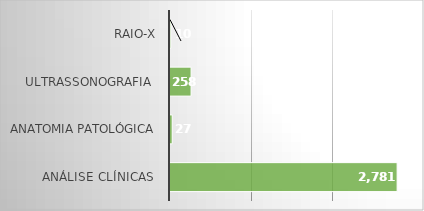
| Category | Series 0 |
|---|---|
| Análise Clínicas  | 2781 |
| Anatomia Patológica | 27 |
| Ultrassonografia  | 258 |
| RAIO-X | 10 |